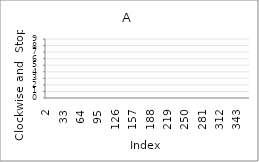
| Category | Series 0 |
|---|---|
| 2.0 | 6 |
| 3.0 | 3 |
| 4.0 | 1 |
| 5.0 | 4 |
| 6.0 | 6 |
| 7.0 | 4 |
| 8.0 | 4 |
| 9.0 | 9 |
| 10.0 | 8 |
| 11.0 | 3 |
| 12.0 | 8 |
| 13.0 | 5 |
| 14.0 | 0 |
| 15.0 | 7 |
| 16.0 | 8 |
| 17.0 | 5 |
| 18.0 | 4 |
| 19.0 | 0 |
| 20.0 | 3 |
| 21.0 | 7 |
| 22.0 | 9 |
| 23.0 | 5 |
| 24.0 | 1 |
| 25.0 | 5 |
| 26.0 | 9 |
| 27.0 | 4 |
| 28.0 | 3 |
| 29.0 | 2 |
| 30.0 | 5 |
| 31.0 | 99 |
| 32.0 | 99 |
| 33.0 | 99 |
| 34.0 | 99 |
| 35.0 | 99 |
| 36.0 | 99 |
| 37.0 | 99 |
| 38.0 | 99 |
| 39.0 | 99 |
| 40.0 | 99 |
| 41.0 | 99 |
| 42.0 | 99 |
| 43.0 | 99 |
| 44.0 | 99 |
| 45.0 | 99 |
| 46.0 | 99 |
| 47.0 | 99 |
| 48.0 | 99 |
| 49.0 | 99 |
| 50.0 | 99 |
| 51.0 | 99 |
| 52.0 | 99 |
| 53.0 | 99 |
| 54.0 | 99 |
| 55.0 | 99 |
| 56.0 | 99 |
| 57.0 | 99 |
| 58.0 | 99 |
| 59.0 | 99 |
| 60.0 | 99 |
| 61.0 | 99 |
| 62.0 | 99 |
| 63.0 | 99 |
| 64.0 | 99 |
| 65.0 | 99 |
| 66.0 | 99 |
| 67.0 | 99 |
| 68.0 | 99 |
| 69.0 | 99 |
| 70.0 | 99 |
| 71.0 | 99 |
| 72.0 | 99 |
| 73.0 | 99 |
| 74.0 | 99 |
| 75.0 | 99 |
| 76.0 | 99 |
| 77.0 | 99 |
| 78.0 | 99 |
| 79.0 | 99 |
| 80.0 | 99 |
| 81.0 | 99 |
| 82.0 | 99 |
| 83.0 | 99 |
| 84.0 | 99 |
| 85.0 | 99 |
| 86.0 | 99 |
| 87.0 | 99 |
| 88.0 | 99 |
| 89.0 | 99 |
| 90.0 | 99 |
| 91.0 | 99 |
| 92.0 | 99 |
| 93.0 | 99 |
| 94.0 | 99 |
| 95.0 | 99 |
| 96.0 | 99 |
| 97.0 | 99 |
| 98.0 | 99 |
| 99.0 | 99 |
| 100.0 | 99 |
| 101.0 | 99 |
| 102.0 | 99 |
| 103.0 | 99 |
| 104.0 | 99 |
| 105.0 | 99 |
| 106.0 | 99 |
| 107.0 | 99 |
| 108.0 | 99 |
| 109.0 | 99 |
| 110.0 | 99 |
| 111.0 | 99 |
| 112.0 | 99 |
| 113.0 | 99 |
| 114.0 | 99 |
| 115.0 | 99 |
| 116.0 | 99 |
| 117.0 | 99 |
| 118.0 | 99 |
| 119.0 | 99 |
| 120.0 | 99 |
| 121.0 | 99 |
| 122.0 | 99 |
| 123.0 | 99 |
| 124.0 | 99 |
| 125.0 | 99 |
| 126.0 | 99 |
| 127.0 | 99 |
| 128.0 | 99 |
| 129.0 | 99 |
| 130.0 | 99 |
| 131.0 | 99 |
| 132.0 | 99 |
| 133.0 | 99 |
| 134.0 | 99 |
| 135.0 | 99 |
| 136.0 | 99 |
| 137.0 | 99 |
| 138.0 | 99 |
| 139.0 | 99 |
| 140.0 | 99 |
| 141.0 | 99 |
| 142.0 | 99 |
| 143.0 | 99 |
| 144.0 | 99 |
| 145.0 | 99 |
| 146.0 | 99 |
| 147.0 | 99 |
| 148.0 | 99 |
| 149.0 | 99 |
| 150.0 | 99 |
| 151.0 | 99 |
| 152.0 | 99 |
| 153.0 | 99 |
| 154.0 | 99 |
| 155.0 | 99 |
| 156.0 | 99 |
| 157.0 | 99 |
| 158.0 | 99 |
| 159.0 | 99 |
| 160.0 | 99 |
| 161.0 | 99 |
| 162.0 | 99 |
| 163.0 | 99 |
| 164.0 | 99 |
| 165.0 | 99 |
| 166.0 | 99 |
| 167.0 | 99 |
| 168.0 | 99 |
| 169.0 | 99 |
| 170.0 | 99 |
| 171.0 | 99 |
| 172.0 | 99 |
| 173.0 | 99 |
| 174.0 | 99 |
| 175.0 | 99 |
| 176.0 | 99 |
| 177.0 | 99 |
| 178.0 | 99 |
| 179.0 | 99 |
| 180.0 | 99 |
| 181.0 | 99 |
| 182.0 | 99 |
| 183.0 | 99 |
| 184.0 | 99 |
| 185.0 | 99 |
| 186.0 | 99 |
| 187.0 | 99 |
| 188.0 | 99 |
| 189.0 | 99 |
| 190.0 | 99 |
| 191.0 | 99 |
| 192.0 | 99 |
| 193.0 | 99 |
| 194.0 | 99 |
| 195.0 | 99 |
| 196.0 | 99 |
| 197.0 | 99 |
| 198.0 | 99 |
| 199.0 | 99 |
| 200.0 | 99 |
| 201.0 | 99 |
| 202.0 | 99 |
| 203.0 | 99 |
| 204.0 | 99 |
| 205.0 | 99 |
| 206.0 | 99 |
| 207.0 | 99 |
| 208.0 | 99 |
| 209.0 | 99 |
| 210.0 | 99 |
| 211.0 | 99 |
| 212.0 | 99 |
| 213.0 | 99 |
| 214.0 | 99 |
| 215.0 | 99 |
| 216.0 | 99 |
| 217.0 | 99 |
| 218.0 | 99 |
| 219.0 | 99 |
| 220.0 | 99 |
| 221.0 | 99 |
| 222.0 | 99 |
| 223.0 | 99 |
| 224.0 | 99 |
| 225.0 | 99 |
| 226.0 | 99 |
| 227.0 | 99 |
| 228.0 | 99 |
| 229.0 | 99 |
| 230.0 | 99 |
| 231.0 | 99 |
| 232.0 | 99 |
| 233.0 | 99 |
| 234.0 | 99 |
| 235.0 | 99 |
| 236.0 | 99 |
| 237.0 | 99 |
| 238.0 | 99 |
| 239.0 | 99 |
| 240.0 | 99 |
| 241.0 | 99 |
| 242.0 | 99 |
| 243.0 | 99 |
| 244.0 | 99 |
| 245.0 | 99 |
| 246.0 | 99 |
| 247.0 | 99 |
| 248.0 | 99 |
| 249.0 | 99 |
| 250.0 | 99 |
| 251.0 | 99 |
| 252.0 | 99 |
| 253.0 | 99 |
| 254.0 | 99 |
| 255.0 | 99 |
| 256.0 | 99 |
| 257.0 | 99 |
| 258.0 | 99 |
| 259.0 | 99 |
| 260.0 | 99 |
| 261.0 | 99 |
| 262.0 | 99 |
| 263.0 | 99 |
| 264.0 | 99 |
| 265.0 | 99 |
| 266.0 | 99 |
| 267.0 | 99 |
| 268.0 | 99 |
| 269.0 | 99 |
| 270.0 | 99 |
| 271.0 | 99 |
| 272.0 | 99 |
| 273.0 | 99 |
| 274.0 | 99 |
| 275.0 | 99 |
| 276.0 | 99 |
| 277.0 | 99 |
| 278.0 | 99 |
| 279.0 | 99 |
| 280.0 | 99 |
| 281.0 | 99 |
| 282.0 | 99 |
| 283.0 | 99 |
| 284.0 | 99 |
| 285.0 | 99 |
| 286.0 | 99 |
| 287.0 | 99 |
| 288.0 | 99 |
| 289.0 | 99 |
| 290.0 | 99 |
| 291.0 | 99 |
| 292.0 | 99 |
| 293.0 | 99 |
| 294.0 | 99 |
| 295.0 | 99 |
| 296.0 | 99 |
| 297.0 | 99 |
| 298.0 | 99 |
| 299.0 | 99 |
| 300.0 | 99 |
| 301.0 | 99 |
| 302.0 | 99 |
| 303.0 | 99 |
| 304.0 | 99 |
| 305.0 | 99 |
| 306.0 | 99 |
| 307.0 | 99 |
| 308.0 | 99 |
| 309.0 | 99 |
| 310.0 | 99 |
| 311.0 | 99 |
| 312.0 | 99 |
| 313.0 | 99 |
| 314.0 | 99 |
| 315.0 | 99 |
| 316.0 | 99 |
| 317.0 | 99 |
| 318.0 | 99 |
| 319.0 | 99 |
| 320.0 | 99 |
| 321.0 | 99 |
| 322.0 | 99 |
| 323.0 | 99 |
| 324.0 | 99 |
| 325.0 | 99 |
| 326.0 | 99 |
| 327.0 | 99 |
| 328.0 | 99 |
| 329.0 | 99 |
| 330.0 | 99 |
| 331.0 | 99 |
| 332.0 | 99 |
| 333.0 | 99 |
| 334.0 | 99 |
| 335.0 | 99 |
| 336.0 | 99 |
| 337.0 | 99 |
| 338.0 | 99 |
| 339.0 | 99 |
| 340.0 | 99 |
| 341.0 | 99 |
| 342.0 | 99 |
| 343.0 | 99 |
| 344.0 | 99 |
| 345.0 | 99 |
| 346.0 | 99 |
| 347.0 | 99 |
| 348.0 | 99 |
| 349.0 | 99 |
| 350.0 | 99 |
| 351.0 | 99 |
| 352.0 | 99 |
| 353.0 | 99 |
| 354.0 | 99 |
| 355.0 | 99 |
| 356.0 | 99 |
| 357.0 | 99 |
| 358.0 | 99 |
| 359.0 | 99 |
| 360.0 | 99 |
| 361.0 | 99 |
| 362.0 | 99 |
| 363.0 | 99 |
| 364.0 | 99 |
| 365.0 | 99 |